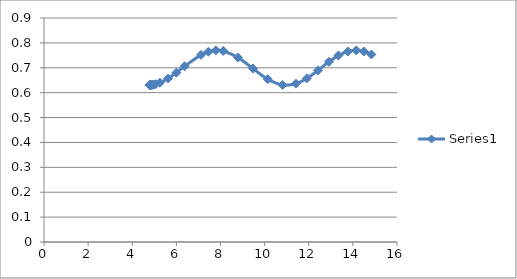
| Category | Series 0 |
|---|---|
| 4.8 | 0.63 |
| 4.8002 | 0.63 |
| 4.8004 | 0.63 |
| 4.8007 | 0.63 |
| 4.8015 | 0.63 |
| 4.8022 | 0.63 |
| 4.8036 | 0.63 |
| 4.8065 | 0.63 |
| 4.8124 | 0.63 |
| 4.824 | 0.63 |
| 4.8356 | 0.63 |
| 4.8589 | 0.631 |
| 4.8821 | 0.631 |
| 4.9286 | 0.632 |
| 4.9752 | 0.632 |
| 5.0682 | 0.634 |
| 5.2543 | 0.64 |
| 5.6264 | 0.657 |
| 5.9985 | 0.68 |
| 6.3706 | 0.706 |
| 7.1149 | 0.752 |
| 7.4513 | 0.764 |
| 7.7877 | 0.77 |
| 8.1242 | 0.768 |
| 8.797 | 0.741 |
| 9.4698 | 0.697 |
| 10.1427 | 0.654 |
| 10.8155 | 0.631 |
| 11.4211 | 0.636 |
| 11.9193 | 0.658 |
| 12.4175 | 0.69 |
| 12.9158 | 0.724 |
| 13.3448 | 0.749 |
| 13.7739 | 0.765 |
| 14.1539 | 0.77 |
| 14.496 | 0.766 |
| 14.838 | 0.754 |